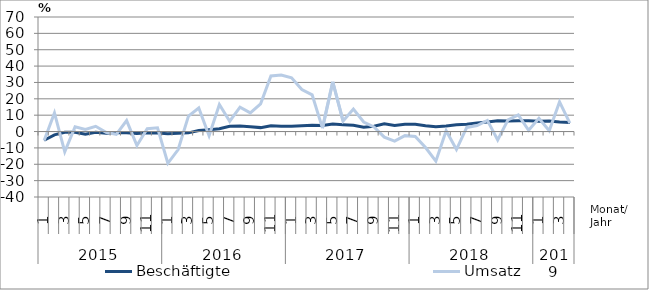
| Category | Beschäftigte | Umsatz |
|---|---|---|
| 0 | -5.3 | -5.5 |
| 1 | -2 | 11.4 |
| 2 | -0.5 | -12.4 |
| 3 | -0.5 | 2.9 |
| 4 | -1.7 | 1.3 |
| 5 | -0.5 | 3.2 |
| 6 | -1.1 | -0.5 |
| 7 | -0.8 | -1.7 |
| 8 | -0.7 | 6.7 |
| 9 | -1.2 | -8.5 |
| 10 | -0.7 | 1.7 |
| 11 | -0.9 | 2.3 |
| 12 | -1.3 | -19.4 |
| 13 | -1.1 | -11 |
| 14 | -0.8 | 9.4 |
| 15 | 0.6 | 14.4 |
| 16 | 1.1 | -2.6 |
| 17 | 1.7 | 16.5 |
| 18 | 3.2 | 6.3 |
| 19 | 3.4 | 14.9 |
| 20 | 3 | 11.4 |
| 21 | 2.4 | 16.9 |
| 22 | 3.6 | 34 |
| 23 | 3.2 | 34.5 |
| 24 | 3.3 | 32.8 |
| 25 | 3.6 | 25.7 |
| 26 | 3.9 | 22.4 |
| 27 | 3.7 | 2.1 |
| 28 | 4.6 | 30.4 |
| 29 | 4.2 | 6.4 |
| 30 | 3.8 | 13.7 |
| 31 | 2.7 | 5.8 |
| 32 | 3.3 | 2.8 |
| 33 | 4.7 | -3.4 |
| 34 | 3.7 | -5.8 |
| 35 | 4.4 | -2.5 |
| 36 | 4.5 | -3 |
| 37 | 3.6 | -9.8 |
| 38 | 2.9 | -18.1 |
| 39 | 3.4 | 0.5 |
| 40 | 4.2 | -11 |
| 41 | 4.5 | 2.5 |
| 42 | 5.3 | 3.7 |
| 43 | 5.8 | 6.8 |
| 44 | 6.6 | -5.2 |
| 45 | 6.5 | 7.1 |
| 46 | 6.6 | 10.1 |
| 47 | 6.6 | 0.8 |
| 48 | 6.3 | 8.1 |
| 49 | 6.5 | 0.5 |
| 50 | 5.8 | 18.1 |
| 51 | 5.5 | 5.1 |